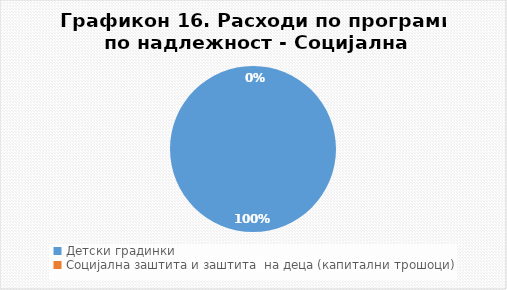
| Category | Структура |
|---|---|
| Детски градинки | 100 |
| Социјална заштита и заштита  на деца (капитални трошоци) | 0 |